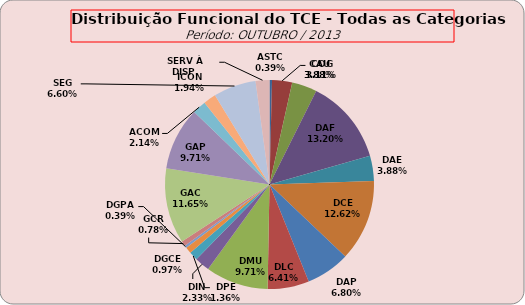
| Category | ASTC COG CAU DAF DAE DCE DAP DLC DMU DIN DPE DGCE DGPA GCR GAC GAP ACOM ICON SEG SERV À DISP. |
|---|---|
| ASTC | 2 |
| COG | 16 |
| CAU | 20 |
| DAF | 68 |
| DAE | 20 |
| DCE | 65 |
| DAP | 35 |
| DLC | 33 |
| DMU | 50 |
| DIN | 12 |
| DPE | 7 |
| DGCE | 5 |
| DGPA | 2 |
| GCR | 4 |
| GAC | 60 |
| GAP | 50 |
| ACOM | 11 |
| ICON | 10 |
| SEG | 34 |
| SERV À DISP. | 11 |